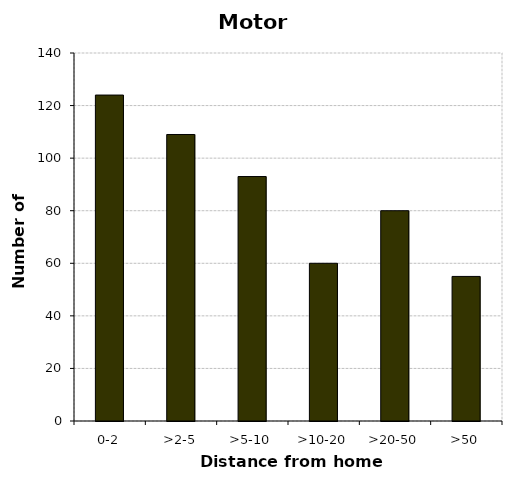
| Category | Motorcycles |
|---|---|
| 0-2 | 124 |
| >2-5 | 109 |
| >5-10 | 93 |
| >10-20 | 60 |
| >20-50 | 80 |
| >50 | 55 |